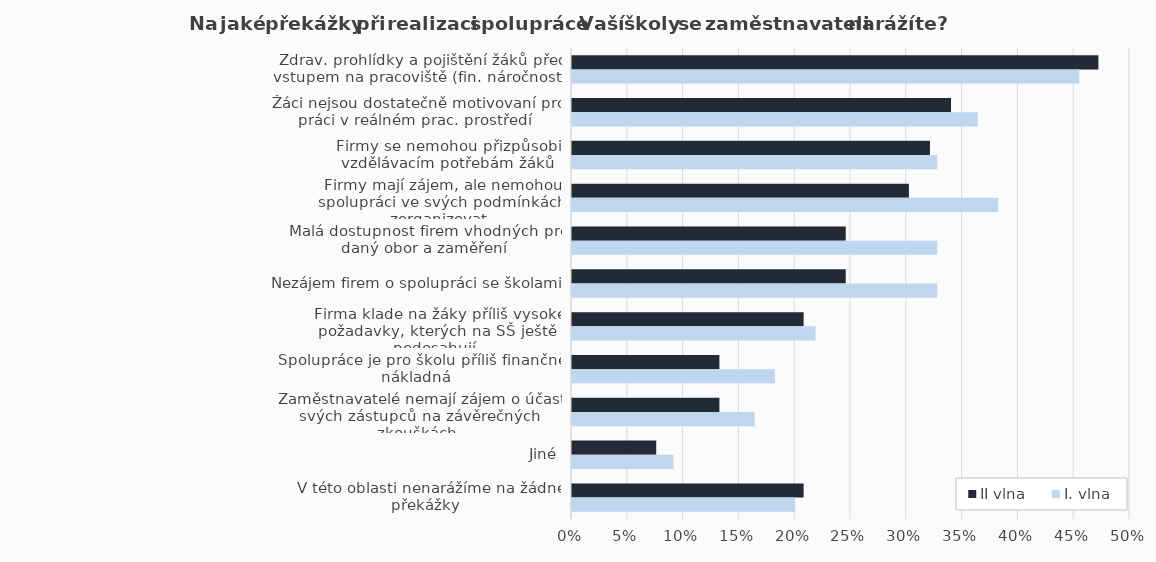
| Category | II vlna | I. vlna |
|---|---|---|
|  Zdrav. prohlídky a pojištění žáků před vstupem na pracoviště (fin. náročnost) | 0.472 | 0.455 |
|  Žáci nejsou dostatečně motivovaní pro práci v reálném prac. prostředí | 0.34 | 0.364 |
|  Firmy se nemohou přizpůsobit vzdělávacím potřebám žáků | 0.321 | 0.327 |
|  Firmy mají zájem, ale nemohou spolupráci ve svých podmínkách zorganizovat | 0.302 | 0.382 |
|  Malá dostupnost firem vhodných pro daný obor a zaměření | 0.245 | 0.327 |
|  Nezájem firem o spolupráci se školami | 0.245 | 0.327 |
|  Firma klade na žáky příliš vysoké požadavky, kterých na SŠ ještě nedosahují | 0.208 | 0.218 |
|  Spolupráce je pro školu příliš finančně nákladná | 0.132 | 0.182 |
|  Zaměstnavatelé nemají zájem o účast svých zástupců na závěrečných zkouškách | 0.132 | 0.164 |
|  Jiné | 0.075 | 0.091 |
|  V této oblasti nenarážíme na žádné překážky | 0.208 | 0.2 |